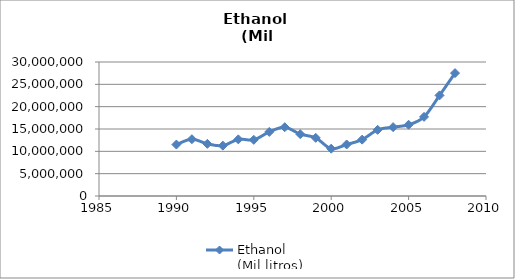
| Category | Ethanol 
(Mil litros) |
|---|---|
| 1990.0 | 11515151 |
| 1991.0 | 12716180 |
| 1992.0 | 11675506 |
| 1993.0 | 11276370 |
| 1994.0 | 12682373 |
| 1995.0 | 12578315 |
| 1996.0 | 14344128 |
| 1997.0 | 15396463 |
| 1998.0 | 13848033 |
| 1999.0 | 13021804 |
| 2000.0 | 10593035 |
| 2001.0 | 11536034 |
| 2002.0 | 12623225 |
| 2003.0 | 14808705 |
| 2004.0 | 15416668 |
| 2005.0 | 15946994 |
| 2006.0 | 17719209 |
| 2007.0 | 22526824.2 |
| 2008.0 | 27512962 |